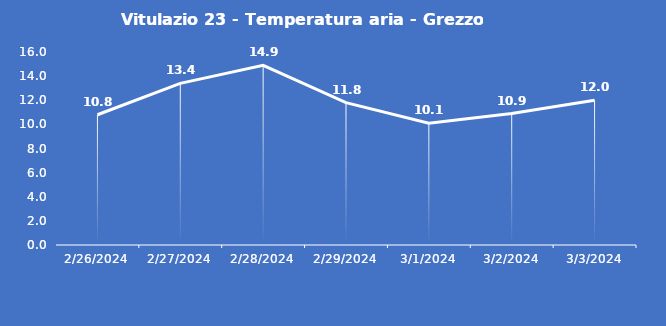
| Category | Vitulazio 23 - Temperatura aria - Grezzo (°C) |
|---|---|
| 2/26/24 | 10.8 |
| 2/27/24 | 13.4 |
| 2/28/24 | 14.9 |
| 2/29/24 | 11.8 |
| 3/1/24 | 10.1 |
| 3/2/24 | 10.9 |
| 3/3/24 | 12 |